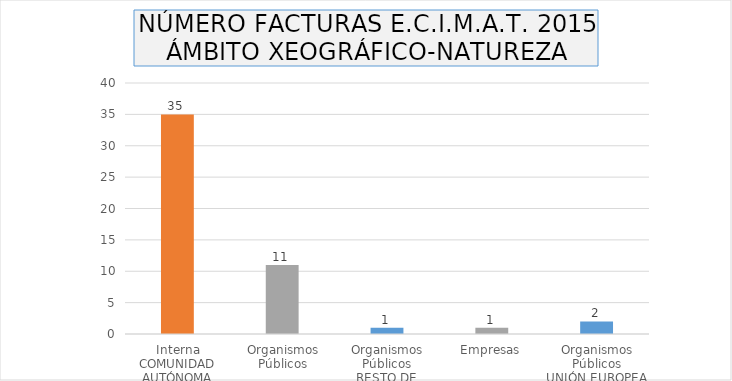
| Category | Series 0 |
|---|---|
| 0 | 35 |
| 1 | 11 |
| 2 | 1 |
| 3 | 1 |
| 4 | 2 |